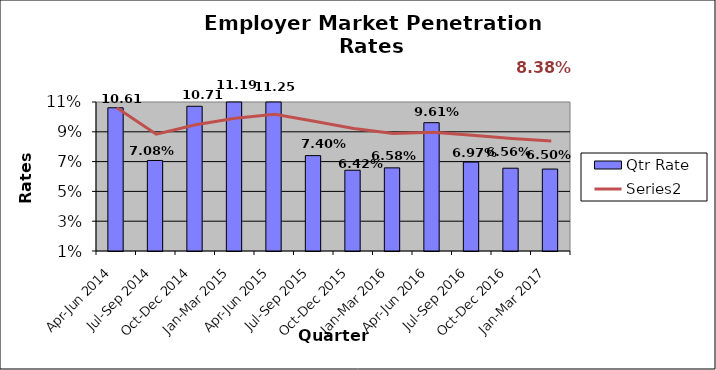
| Category | Qtr Rate |
|---|---|
| Apr-Jun 2014 | 0.106 |
| Jul-Sep 2014 | 0.071 |
| Oct-Dec 2014 | 0.107 |
| Jan-Mar 2015 | 0.112 |
| Apr-Jun 2015 | 0.112 |
| Jul-Sep 2015 | 0.074 |
| Oct-Dec 2015 | 0.064 |
| Jan-Mar 2016 | 0.066 |
| Apr-Jun 2016 | 0.096 |
| Jul-Sep 2016 | 0.07 |
| Oct-Dec 2016 | 0.066 |
| Jan-Mar 2017 | 0.065 |